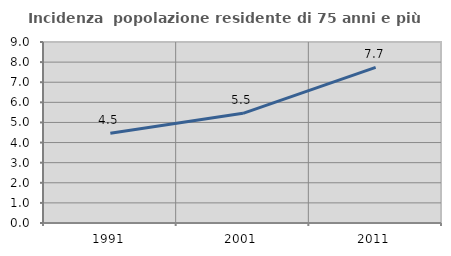
| Category | Incidenza  popolazione residente di 75 anni e più |
|---|---|
| 1991.0 | 4.464 |
| 2001.0 | 5.453 |
| 2011.0 | 7.737 |